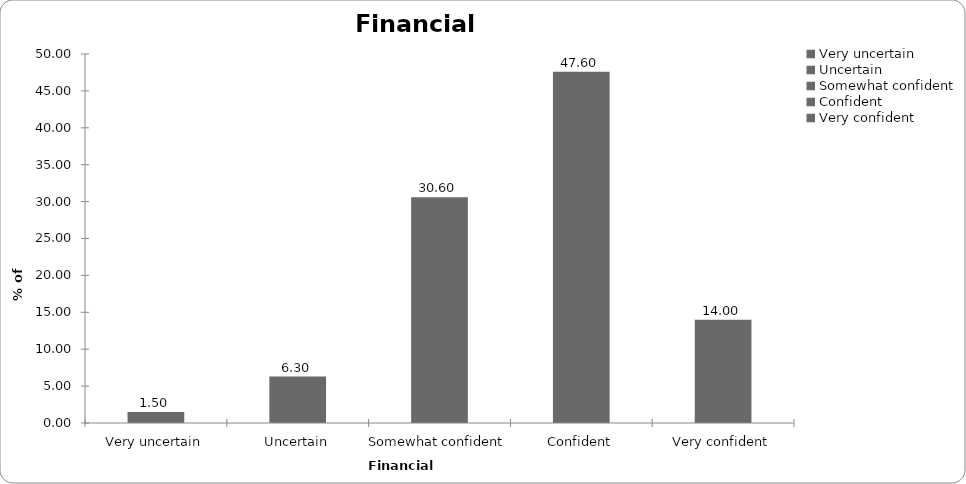
| Category | Financial confidence |
|---|---|
| Very uncertain | 1.5 |
| Uncertain | 6.3 |
| Somewhat confident | 30.6 |
| Confident | 47.6 |
| Very confident | 14 |